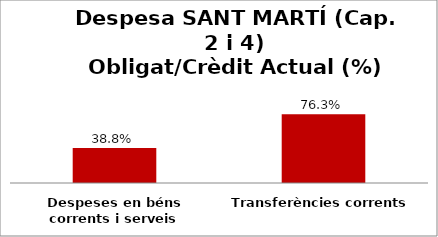
| Category | Series 0 |
|---|---|
| Despeses en béns corrents i serveis | 0.388 |
| Transferències corrents | 0.763 |